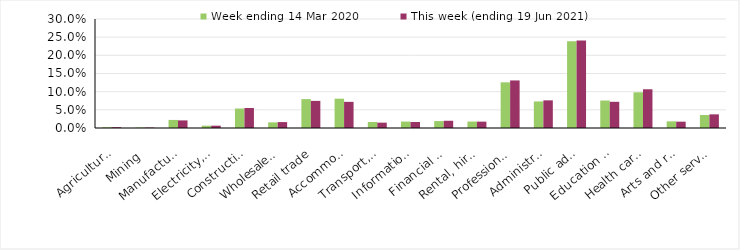
| Category | Week ending 14 Mar 2020 | This week (ending 19 Jun 2021) |
|---|---|---|
| Agriculture, forestry and fishing | 0.002 | 0.002 |
| Mining | 0.001 | 0.001 |
| Manufacturing | 0.022 | 0.021 |
| Electricity, gas, water and waste services | 0.006 | 0.006 |
| Construction | 0.054 | 0.055 |
| Wholesale trade | 0.016 | 0.016 |
| Retail trade | 0.08 | 0.075 |
| Accommodation and food services | 0.081 | 0.072 |
| Transport, postal and warehousing | 0.016 | 0.015 |
| Information media and telecommunications | 0.018 | 0.016 |
| Financial and insurance services | 0.019 | 0.02 |
| Rental, hiring and real estate services | 0.018 | 0.018 |
| Professional, scientific and technical services | 0.126 | 0.131 |
| Administrative and support services | 0.073 | 0.076 |
| Public administration and safety | 0.239 | 0.241 |
| Education and training | 0.076 | 0.072 |
| Health care and social assistance | 0.098 | 0.107 |
| Arts and recreation services | 0.018 | 0.017 |
| Other services | 0.036 | 0.038 |